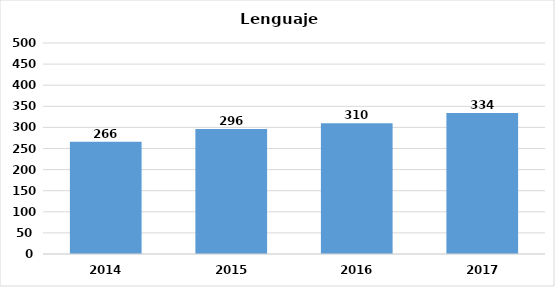
| Category | Series 0 |
|---|---|
| 2014.0 | 266 |
| 2015.0 | 296 |
| 2016.0 | 310 |
| 2017.0 | 334 |